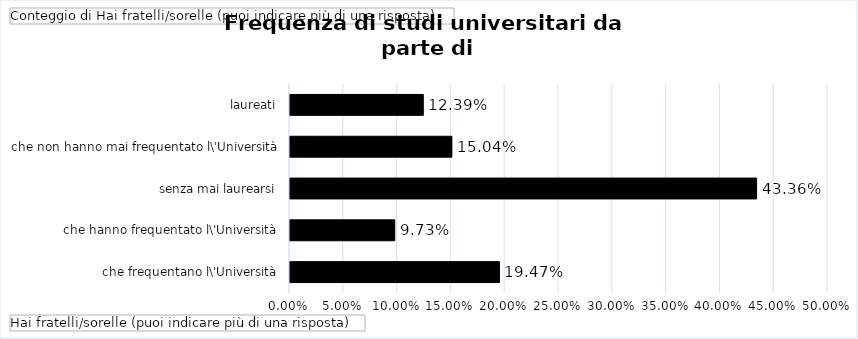
| Category | Totale |
|---|---|
| che frequentano l\'Università | 0.195 |
| che hanno frequentato l\'Università, senza mai laurearsi | 0.097 |
| che non hanno mai frequentato l\'Università | 0.434 |
| laureati | 0.15 |
| non ho fratelli/sorelle | 0.124 |